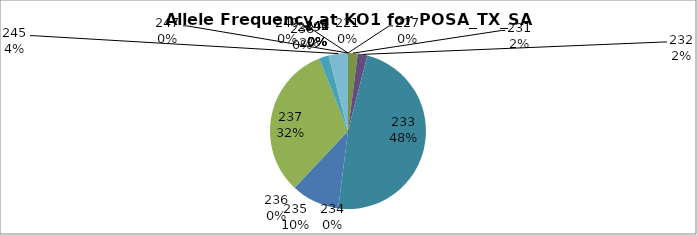
| Category | Series 0 |
|---|---|
| 221.0 | 0 |
| 227.0 | 0 |
| 231.0 | 0.02 |
| 232.0 | 0.02 |
| 233.0 | 0.48 |
| 234.0 | 0 |
| 235.0 | 0.1 |
| 236.0 | 0 |
| 237.0 | 0.32 |
| 238.0 | 0 |
| 239.0 | 0.02 |
| 240.0 | 0 |
| 241.0 | 0 |
| 242.0 | 0 |
| 243.0 | 0 |
| 244.0 | 0 |
| 245.0 | 0.04 |
| 247.0 | 0 |
| 249.0 | 0 |